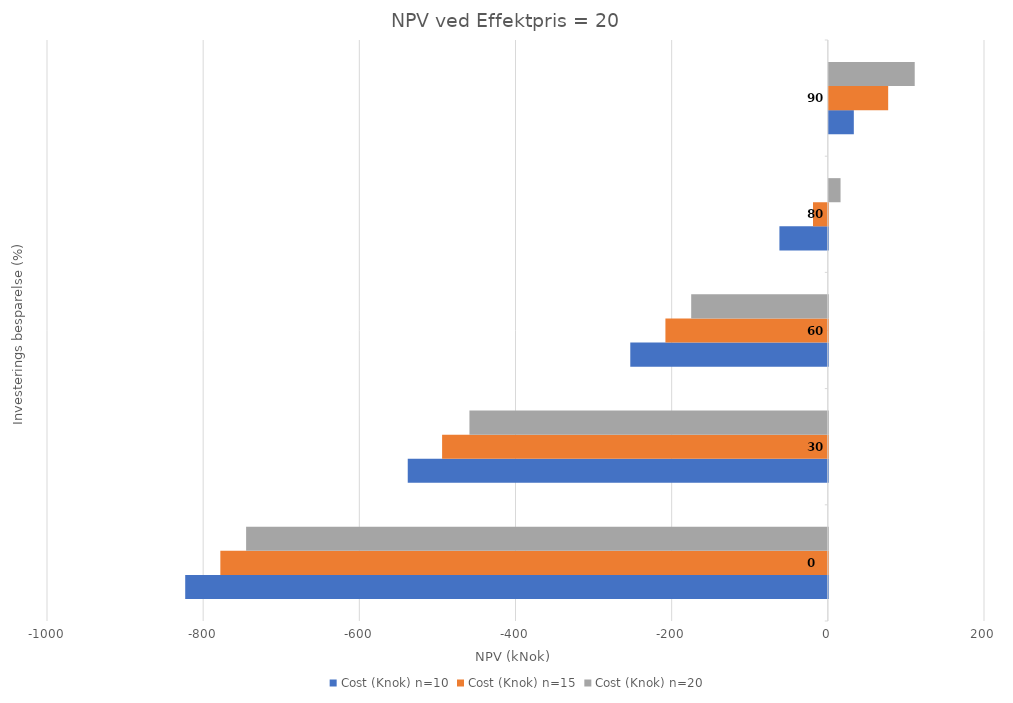
| Category | Cost (Knok) n=10 | Cost (Knok) n=15 | Cost (Knok) n=20 |
|---|---|---|---|
| 0.0 | -823 | -778 | -745 |
| 30.0 | -538 | -494 | -459 |
| 60.0 | -253 | -208 | -175 |
| 80.0 | -62 | -19 | 15 |
| 90.0 | 32 | 76 | 110 |